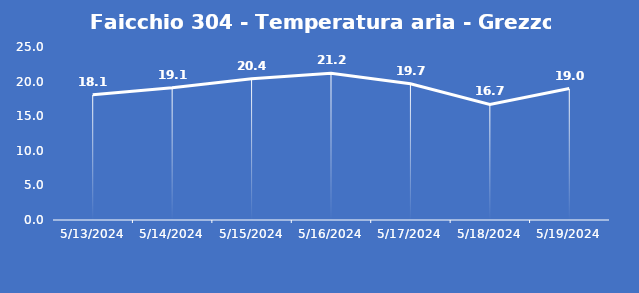
| Category | Faicchio 304 - Temperatura aria - Grezzo (°C) |
|---|---|
| 5/13/24 | 18.1 |
| 5/14/24 | 19.1 |
| 5/15/24 | 20.4 |
| 5/16/24 | 21.2 |
| 5/17/24 | 19.7 |
| 5/18/24 | 16.7 |
| 5/19/24 | 19 |